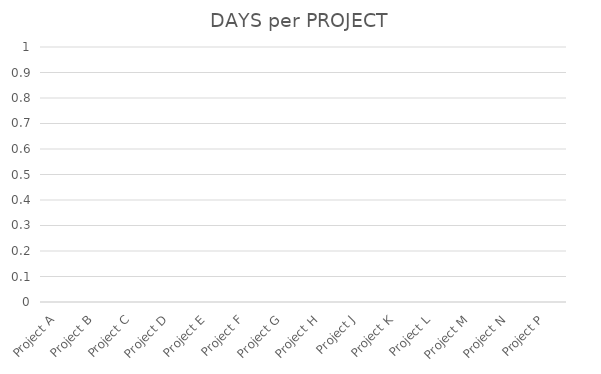
| Category | # of DAYS |
|---|---|
| Project A | 0 |
| Project B | 0 |
| Project C | 0 |
| Project D | 0 |
| Project E | 0 |
| Project F | 0 |
| Project G | 0 |
| Project H | 0 |
| Project J | 0 |
| Project K | 0 |
| Project L | 0 |
| Project M | 0 |
| Project N | 0 |
| Project P | 0 |